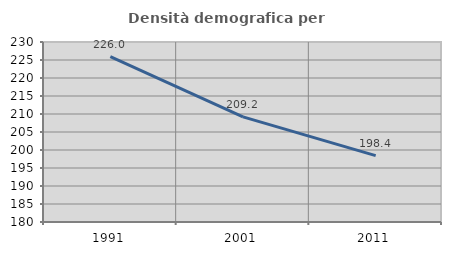
| Category | Densità demografica |
|---|---|
| 1991.0 | 225.959 |
| 2001.0 | 209.195 |
| 2011.0 | 198.442 |